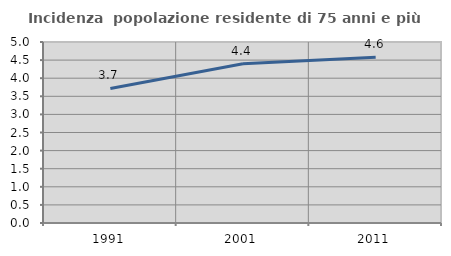
| Category | Incidenza  popolazione residente di 75 anni e più |
|---|---|
| 1991.0 | 3.716 |
| 2001.0 | 4.4 |
| 2011.0 | 4.577 |